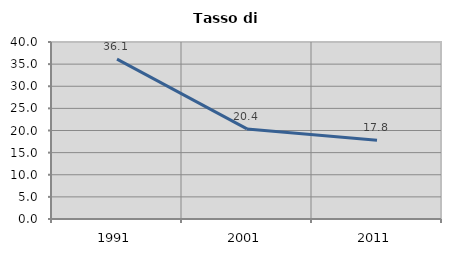
| Category | Tasso di disoccupazione   |
|---|---|
| 1991.0 | 36.145 |
| 2001.0 | 20.362 |
| 2011.0 | 17.788 |